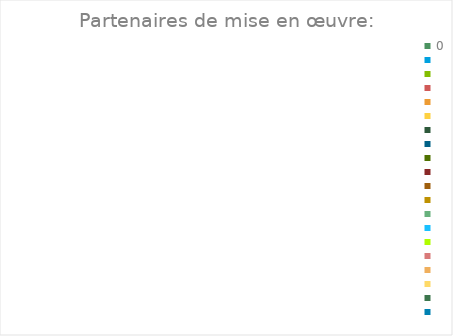
| Category | Series 0 |
|---|---|
| 0.0 | 0 |
| nan | 0 |
| nan | 0 |
| nan | 0 |
| nan | 0 |
| nan | 0 |
| nan | 0 |
| nan | 0 |
| nan | 0 |
| nan | 0 |
| nan | 0 |
| nan | 0 |
| nan | 0 |
| nan | 0 |
| nan | 0 |
| nan | 0 |
| nan | 0 |
| nan | 0 |
| nan | 0 |
| nan | 0 |